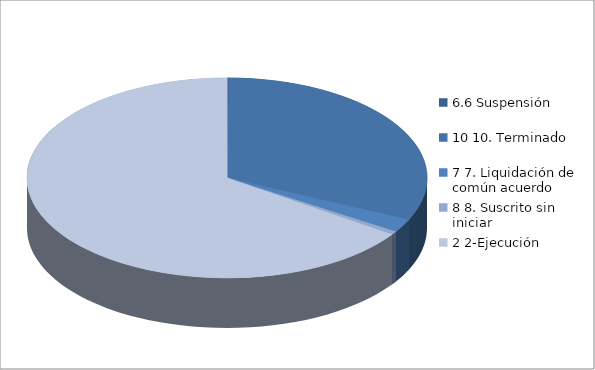
| Category | Series 0 |
|---|---|
| 6.6 Suspensión | 1 |
| 10 10. Terminado | 232 |
| 7 7. Liquidación de común acuerdo | 16 |
| 8 8. Suscrito sin iniciar | 4 |
| 2 2-Ejecución | 479 |